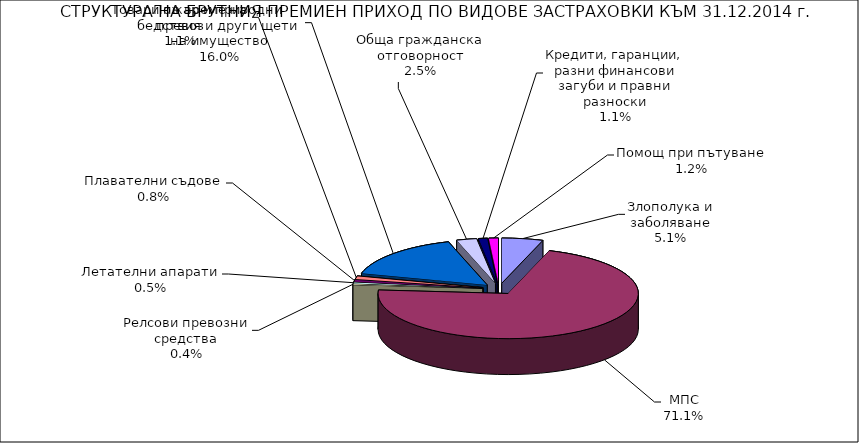
| Category | Series 0 |
|---|---|
| Злополука и заболяване | 0.051 |
| МПС | 0.711 |
| Релсови превозни средства | 0.004 |
| Летателни апарати | 0.005 |
| Плавателни съдове | 0.008 |
| Товари по време на превоз | 0.011 |
| Пожар и природни бедствия и други щети на имущество | 0.16 |
| Обща гражданска отговорност | 0.025 |
| Кредити, гаранции, разни финансови загуби и правни разноски | 0.011 |
| Помощ при пътуване | 0.012 |